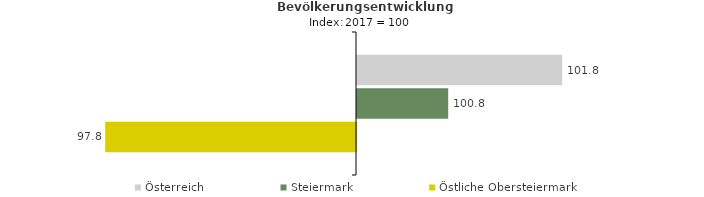
| Category | Österreich | Steiermark | Östliche Obersteiermark |
|---|---|---|---|
| 2021.0 | 101.8 | 100.8 | 97.8 |